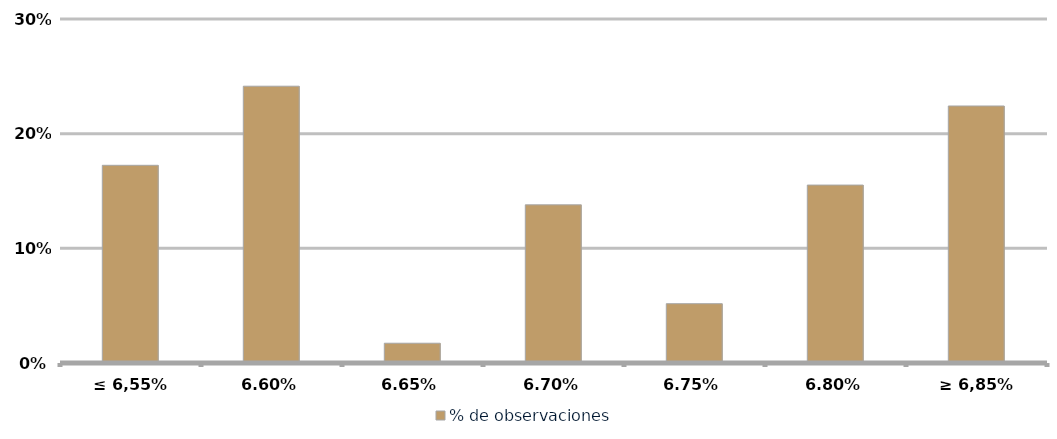
| Category | % de observaciones  |
|---|---|
| ≤ 6,55% | 0.172 |
| 6,60% | 0.241 |
| 6,65% | 0.017 |
| 6,70% | 0.138 |
| 6,75% | 0.052 |
| 6,80% | 0.155 |
| ≥ 6,85% | 0.224 |